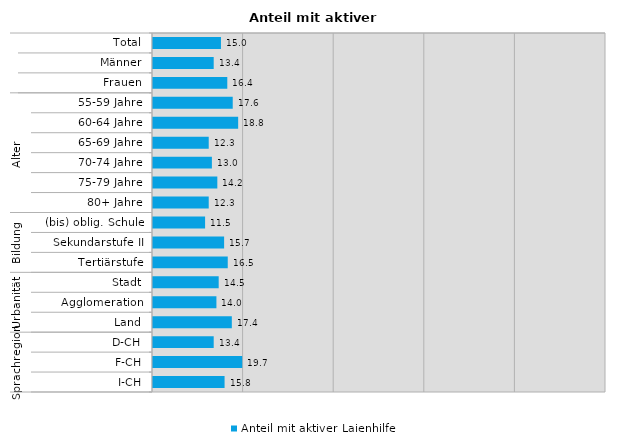
| Category | Anteil mit aktiver Laienhilfe |
|---|---|
| 0 | 15 |
| 1 | 13.4 |
| 2 | 16.4 |
| 3 | 17.6 |
| 4 | 18.8 |
| 5 | 12.3 |
| 6 | 13 |
| 7 | 14.2 |
| 8 | 12.3 |
| 9 | 11.5 |
| 10 | 15.7 |
| 11 | 16.5 |
| 12 | 14.5 |
| 13 | 14 |
| 14 | 17.4 |
| 15 | 13.4 |
| 16 | 19.7 |
| 17 | 15.8 |